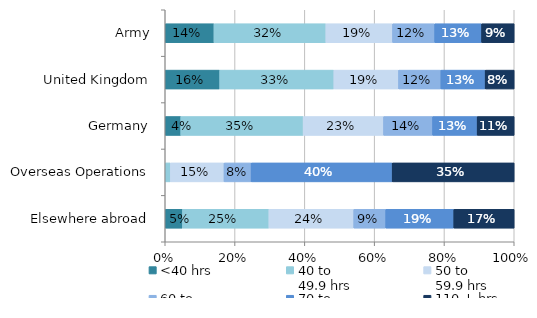
| Category | <40 hrs | 40 to 
49.9 hrs | 50 to 
59.9 hrs | 60 to 
69.9 hrs | 70 to 
109.9 hrs | 110 + hrs |
|---|---|---|---|---|---|---|
| Army | 0.14 | 0.321 | 0.191 | 0.121 | 0.134 | 0.093 |
| United Kingdom | 0.156 | 0.327 | 0.185 | 0.121 | 0.127 | 0.083 |
| Germany | 0.045 | 0.351 | 0.23 | 0.14 | 0.128 | 0.106 |
| Overseas Operations | 0 | 0.015 | 0.153 | 0.078 | 0.404 | 0.35 |
| Elsewhere abroad | 0.05 | 0.248 | 0.243 | 0.092 | 0.195 | 0.173 |